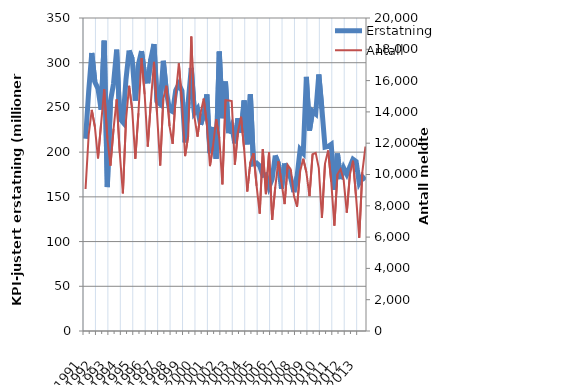
| Category | Erstatning |
|---|---|
| 1991.0 | 215.004 |
| nan | 267.504 |
| nan | 310.899 |
| nan | 278.454 |
| 1992.0 | 271.059 |
| nan | 247.673 |
| nan | 324.574 |
| nan | 160.976 |
| 1993.0 | 256.801 |
| nan | 276.693 |
| nan | 314.577 |
| nan | 237.531 |
| 1994.0 | 233.488 |
| nan | 281.142 |
| nan | 313.591 |
| nan | 304.235 |
| 1995.0 | 257.595 |
| nan | 297.989 |
| nan | 312.93 |
| nan | 286.552 |
| 1996.0 | 277.028 |
| nan | 304.113 |
| nan | 320.864 |
| nan | 256.523 |
| 1997.0 | 253.617 |
| nan | 302.072 |
| nan | 267.373 |
| nan | 247.176 |
| 1998.0 | 245.333 |
| nan | 269.126 |
| nan | 275.966 |
| nan | 268.541 |
| 1999.0 | 210.966 |
| nan | 255.986 |
| nan | 294.196 |
| nan | 244.01 |
| 2000.0 | 248.73 |
| nan | 230.669 |
| nan | 241.961 |
| nan | 264.522 |
| 2001.0 | 198.918 |
| nan | 228.152 |
| nan | 192.663 |
| nan | 312.483 |
| 2002.0 | 237.915 |
| nan | 278.926 |
| nan | 221.198 |
| nan | 229.654 |
| 2003.0 | 209.827 |
| nan | 237.76 |
| nan | 221.701 |
| nan | 257.782 |
| 2004.0 | 208.77 |
| nan | 264.654 |
| nan | 186.983 |
| nan | 187.764 |
| 2005.0 | 184.561 |
| nan | 173.945 |
| nan | 174.667 |
| nan | 160.852 |
| 2006.0 | 169.716 |
| nan | 196.264 |
| nan | 187.186 |
| nan | 159.115 |
| 2007.0 | 187.203 |
| nan | 178.828 |
| nan | 170.552 |
| nan | 155.33 |
| 2008.0 | 172.577 |
| nan | 202.916 |
| nan | 198.861 |
| nan | 284.085 |
| 2009.0 | 224.116 |
| nan | 245.97 |
| nan | 242.891 |
| nan | 286.88 |
| 2010.0 | 248.2 |
| nan | 205.51 |
| nan | 206.354 |
| nan | 208.814 |
| 2011.0 | 157.942 |
| nan | 198.404 |
| nan | 169.886 |
| nan | 182.352 |
| 2012.0 | 175.337 |
| nan | 183.788 |
| nan | 192.075 |
| nan | 189.552 |
| 2013.0 | 165.829 |
| nan | 172.363 |
| nan | 168.821 |